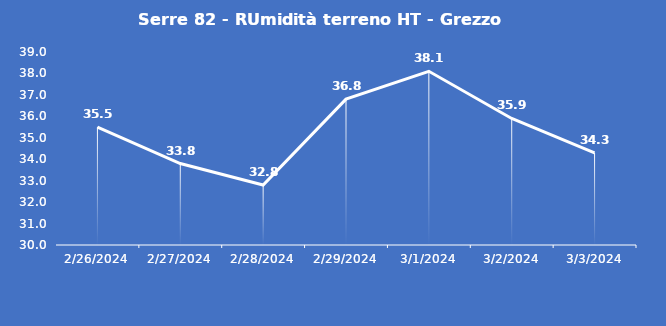
| Category | Serre 82 - RUmidità terreno HT - Grezzo (%VWC) |
|---|---|
| 2/26/24 | 35.5 |
| 2/27/24 | 33.8 |
| 2/28/24 | 32.8 |
| 2/29/24 | 36.8 |
| 3/1/24 | 38.1 |
| 3/2/24 | 35.9 |
| 3/3/24 | 34.3 |